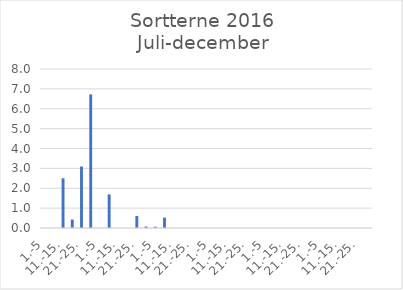
| Category | Series 0 |
|---|---|
| 1.-5 | 0 |
| 6.-10. | 0 |
| 11.-15. | 2.5 |
| 16.-20. | 0.426 |
| 21.-25. | 3.094 |
| 26.-31. | 6.722 |
| 1.-5 | 0 |
| 6.-10. | 1.691 |
| 11.-15. | 0 |
| 16.-20. | 0 |
| 21.-25. | 0.607 |
| 26.-31. | 0.074 |
| 1.-5 | 0.064 |
| 6.-10. | 0.523 |
| 11.-15. | 0 |
| 16.-20. | 0 |
| 21.-25. | 0 |
| 26.-30. | 0 |
| 1.-5 | 0 |
| 6.-10. | 0 |
| 11.-15. | 0 |
| 16.-20. | 0 |
| 21.-25. | 0 |
| 26.-31. | 0 |
| 1.-5 | 0 |
| 6.-10. | 0 |
| 11.-15. | 0 |
| 16.-20. | 0 |
| 21.-25. | 0 |
| 26.-30. | 0 |
| 1.-5 | 0 |
| 6.-10. | 0 |
| 11.-15. | 0 |
| 16.-20. | 0 |
| 21.-25. | 0 |
| 26.-31. | 0 |